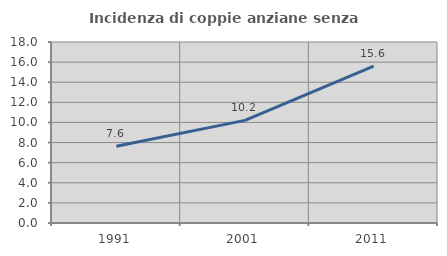
| Category | Incidenza di coppie anziane senza figli  |
|---|---|
| 1991.0 | 7.641 |
| 2001.0 | 10.204 |
| 2011.0 | 15.595 |